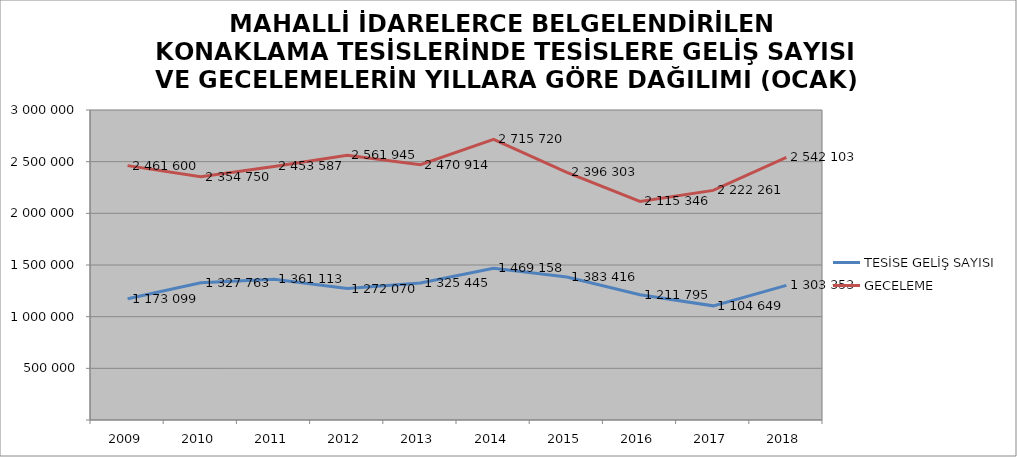
| Category | TESİSE GELİŞ SAYISI | GECELEME |
|---|---|---|
| 2009 | 1173099 | 2461600 |
| 2010 | 1327763 | 2354750 |
| 2011 | 1361113 | 2453587 |
| 2012 | 1272070 | 2561945 |
| 2013 | 1325445 | 2470914 |
| 2014 | 1469158 | 2715720 |
| 2015 | 1383416 | 2396303 |
| 2016 | 1211795 | 2115346 |
| 2017 | 1104649 | 2222261 |
| 2018 | 1303353 | 2542103 |